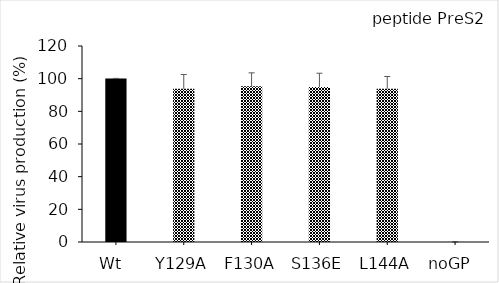
| Category | Series 0 |
|---|---|
| Wt  | 100.051 |
| Y129A | 93.763 |
| F130A | 95.286 |
| S136E | 94.822 |
| L144A | 93.84 |
| noGP  | 0.038 |